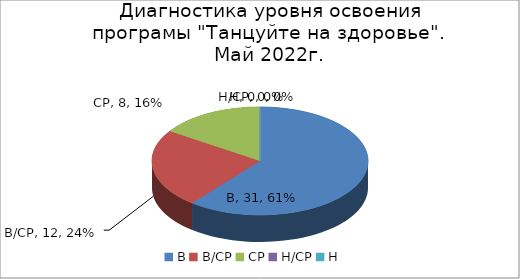
| Category | Май 2022 |
|---|---|
| В | 31 |
| В/СР | 12 |
| СР | 8 |
| Н/СР | 0 |
| Н | 0 |